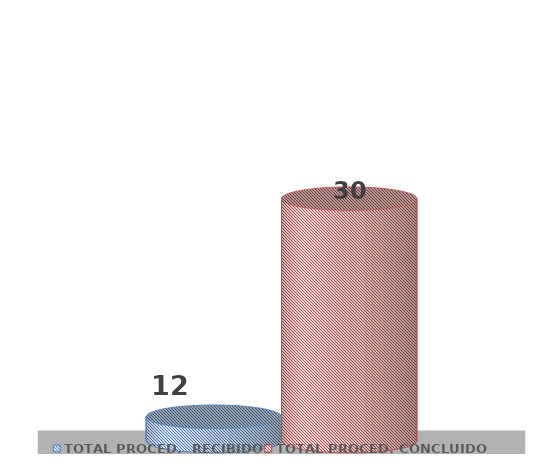
| Category | TOTAL PROCED.  RECIBIDOS | TOTAL PROCED. CONCLUIDOS |
|---|---|---|
| 0 | 12 | 30 |